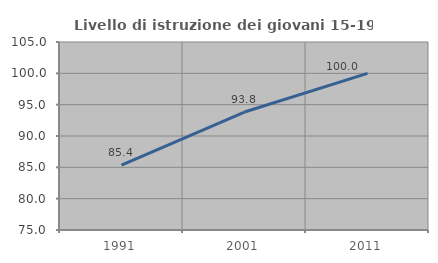
| Category | Livello di istruzione dei giovani 15-19 anni |
|---|---|
| 1991.0 | 85.366 |
| 2001.0 | 93.827 |
| 2011.0 | 100 |